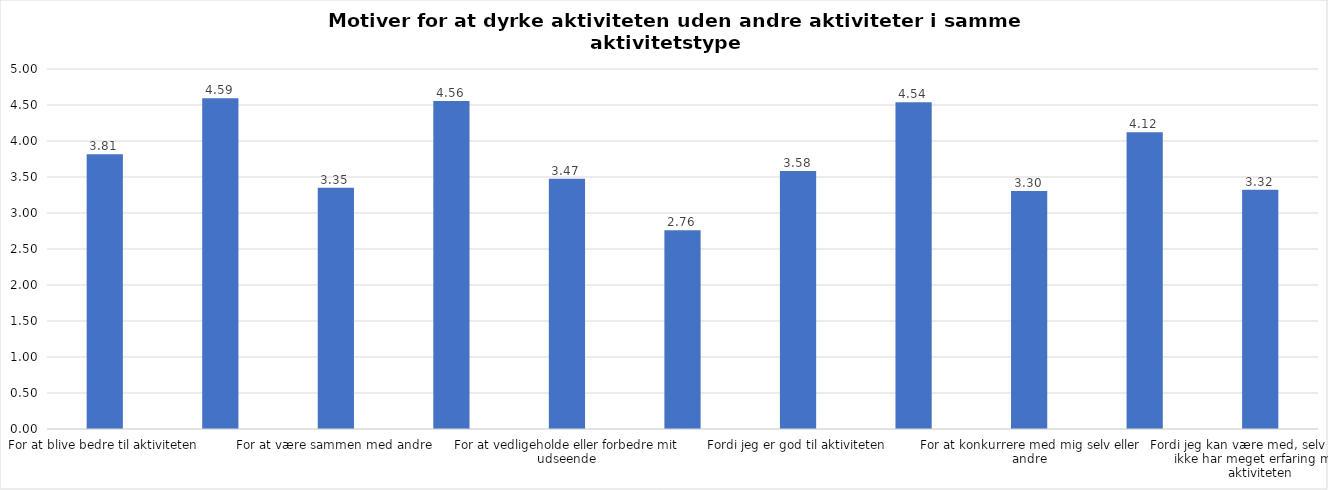
| Category | Gennemsnit |
|---|---|
| For at blive bedre til aktiviteten | 3.814 |
| For at vedligeholde eller forbedre min sundhed (fx helbred, fysisk form) | 4.593 |
| For at være sammen med andre | 3.35 |
| For at gøre noget godt for mig selv | 4.555 |
| For at vedligeholde eller forbedre mit udseende | 3.474 |
| Fordi andre i min omgangskreds opmuntrer mig til det | 2.762 |
| Fordi jeg er god til aktiviteten | 3.585 |
| Fordi jeg godt kan lide aktiviteten | 4.537 |
| For at konkurrere med mig selv eller andre | 3.305 |
| Fordi aktiviteten passer godt ind i min hverdag | 4.123 |
| Fordi jeg kan være med, selv om jeg ikke har meget erfaring med aktiviteten | 3.324 |